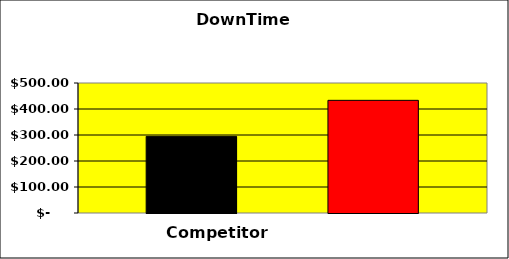
| Category | Series 0 | Series 1 | Series 2 |
|---|---|---|---|
| 0 | 294.667 |  | 433.333 |